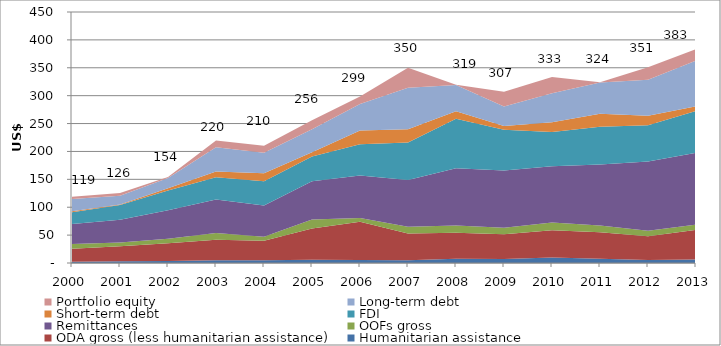
| Category | Humanitarian assistance | ODA gross (less humanitarian assistance) | OOFs gross | Remittances | FDI | Short-term debt | Long-term debt | Portfolio equity |
|---|---|---|---|---|---|---|---|---|
| 2000.0 | 2351.797 | 23228.067 | 8426.49 | 36082.581 | 20871.824 | 1919.846 | 21852.525 | 4097.114 |
| 2001.0 | 3034.028 | 27159.869 | 6544.64 | 40796.139 | 26626.277 | 583.989 | 15905.131 | 4909.465 |
| 2002.0 | 3582.781 | 32049.502 | 7650.26 | 51439.418 | 35059.081 | 4315.244 | 18384.691 | 1868.625 |
| 2003.0 | 4927.01 | 36598.499 | 12160.2 | 60260.347 | 39611.57 | 10273.639 | 43744.852 | 12250.051 |
| 2004.0 | 4892.172 | 35193.272 | 6797.59 | 56381.149 | 43194.618 | 14383.941 | 37039.07 | 12448.486 |
| 2005.0 | 5912.276 | 56155.553 | 15999.28 | 68417.655 | 44228.718 | 7633.121 | 41229.257 | 16515.988 |
| 2006.0 | 5366.864 | 68409.197 | 6887.53 | 76381.681 | 55690.568 | 24975.384 | 47428.503 | 13461.214 |
| 2007.0 | 5140.231 | 47753.608 | 12314.23 | 83530.004 | 67332.599 | 23610.416 | 74478.067 | 36021.883 |
| 2008.0 | 7569.06 | 46717.366 | 12918.7 | 102446.265 | 88999.168 | 13190.786 | 47405.324 | 117.626 |
| 2009.0 | 7137.07 | 44418.068 | 11601.3 | 102715.11 | 72837.088 | 6982.845 | 34978.248 | 26514.646 |
| 2010.0 | 9921.725 | 48621.66 | 14019.18 | 100843.022 | 61539.982 | 17516.552 | 51663.481 | 29318.918 |
| 2011.0 | 7599.623 | 47740.438 | 11784.78 | 109678.918 | 67535.923 | 23056.888 | 56205.85 | 503.365 |
| 2012.0 | 5427.101 | 42679.305 | 9918.75 | 124044.992 | 64882.561 | 16849.159 | 64748.635 | 22277.798 |
| 2013.0 | 6394.584 | 52893.675 | 9386.87 | 128827.874 | 75281.811 | 8103.2 | 81964.009 | 20416.669 |